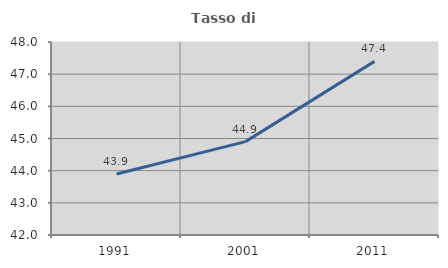
| Category | Tasso di occupazione   |
|---|---|
| 1991.0 | 43.894 |
| 2001.0 | 44.903 |
| 2011.0 | 47.398 |